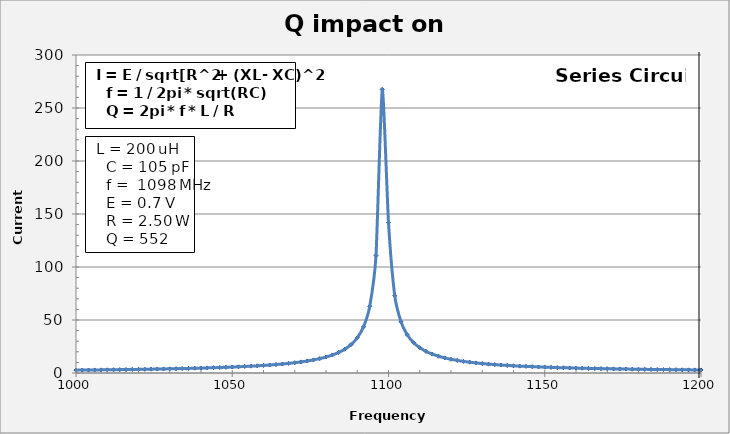
| Category | 552 |
|---|---|
| 900.0 | 1.265 |
| 902.0 | 1.28 |
| 904.0 | 1.294 |
| 906.0 | 1.309 |
| 908.0 | 1.325 |
| 910.0 | 1.34 |
| 912.0 | 1.356 |
| 914.0 | 1.373 |
| 916.0 | 1.39 |
| 918.0 | 1.407 |
| 920.0 | 1.424 |
| 922.0 | 1.442 |
| 924.0 | 1.46 |
| 926.0 | 1.479 |
| 928.0 | 1.498 |
| 930.0 | 1.518 |
| 932.0 | 1.538 |
| 934.0 | 1.558 |
| 936.0 | 1.579 |
| 938.0 | 1.601 |
| 940.0 | 1.623 |
| 942.0 | 1.645 |
| 944.0 | 1.669 |
| 946.0 | 1.692 |
| 948.0 | 1.717 |
| 950.0 | 1.742 |
| 952.0 | 1.768 |
| 954.0 | 1.794 |
| 956.0 | 1.822 |
| 958.0 | 1.85 |
| 960.0 | 1.879 |
| 962.0 | 1.908 |
| 964.0 | 1.939 |
| 966.0 | 1.97 |
| 968.0 | 2.003 |
| 970.0 | 2.036 |
| 972.0 | 2.071 |
| 974.0 | 2.106 |
| 976.0 | 2.143 |
| 978.0 | 2.181 |
| 980.0 | 2.22 |
| 982.0 | 2.261 |
| 984.0 | 2.303 |
| 986.0 | 2.346 |
| 988.0 | 2.391 |
| 990.0 | 2.438 |
| 992.0 | 2.487 |
| 994.0 | 2.537 |
| 996.0 | 2.589 |
| 998.0 | 2.644 |
| 1000.0 | 2.7 |
| 1002.0 | 2.759 |
| 1004.0 | 2.821 |
| 1006.0 | 2.885 |
| 1008.0 | 2.952 |
| 1010.0 | 3.022 |
| 1012.0 | 3.095 |
| 1014.0 | 3.172 |
| 1016.0 | 3.252 |
| 1018.0 | 3.337 |
| 1020.0 | 3.425 |
| 1022.0 | 3.519 |
| 1024.0 | 3.617 |
| 1026.0 | 3.721 |
| 1028.0 | 3.83 |
| 1030.0 | 3.946 |
| 1032.0 | 4.07 |
| 1034.0 | 4.2 |
| 1036.0 | 4.339 |
| 1038.0 | 4.488 |
| 1040.0 | 4.646 |
| 1042.0 | 4.816 |
| 1044.0 | 4.998 |
| 1046.0 | 5.194 |
| 1048.0 | 5.406 |
| 1050.0 | 5.635 |
| 1052.0 | 5.884 |
| 1054.0 | 6.156 |
| 1056.0 | 6.453 |
| 1058.0 | 6.779 |
| 1060.0 | 7.14 |
| 1062.0 | 7.54 |
| 1064.0 | 7.987 |
| 1066.0 | 8.489 |
| 1068.0 | 9.057 |
| 1070.0 | 9.706 |
| 1072.0 | 10.452 |
| 1074.0 | 11.322 |
| 1076.0 | 12.347 |
| 1078.0 | 13.573 |
| 1080.0 | 15.066 |
| 1082.0 | 16.923 |
| 1084.0 | 19.296 |
| 1086.0 | 22.434 |
| 1088.0 | 26.776 |
| 1090.0 | 33.172 |
| 1092.0 | 43.508 |
| 1094.0 | 62.909 |
| 1096.0 | 110.814 |
| 1098.0 | 267.633 |
| 1100.0 | 141.854 |
| 1102.0 | 72.918 |
| 1104.0 | 48.306 |
| 1106.0 | 36.025 |
| 1108.0 | 28.706 |
| 1110.0 | 23.857 |
| 1112.0 | 20.411 |
| 1114.0 | 17.837 |
| 1116.0 | 15.842 |
| 1118.0 | 14.25 |
| 1120.0 | 12.951 |
| 1122.0 | 11.87 |
| 1124.0 | 10.957 |
| 1126.0 | 10.176 |
| 1128.0 | 9.5 |
| 1130.0 | 8.909 |
| 1132.0 | 8.388 |
| 1134.0 | 7.925 |
| 1136.0 | 7.511 |
| 1138.0 | 7.139 |
| 1140.0 | 6.803 |
| 1142.0 | 6.497 |
| 1144.0 | 6.218 |
| 1146.0 | 5.963 |
| 1148.0 | 5.728 |
| 1150.0 | 5.511 |
| 1152.0 | 5.31 |
| 1154.0 | 5.124 |
| 1156.0 | 4.95 |
| 1158.0 | 4.789 |
| 1160.0 | 4.637 |
| 1162.0 | 4.496 |
| 1164.0 | 4.362 |
| 1166.0 | 4.237 |
| 1168.0 | 4.119 |
| 1170.0 | 4.007 |
| 1172.0 | 3.902 |
| 1174.0 | 3.802 |
| 1176.0 | 3.707 |
| 1178.0 | 3.617 |
| 1180.0 | 3.531 |
| 1182.0 | 3.45 |
| 1184.0 | 3.372 |
| 1186.0 | 3.298 |
| 1188.0 | 3.227 |
| 1190.0 | 3.159 |
| 1192.0 | 3.094 |
| 1194.0 | 3.032 |
| 1196.0 | 2.972 |
| 1198.0 | 2.915 |
| 1200.0 | 2.86 |
| 1202.0 | 2.807 |
| 1204.0 | 2.756 |
| 1206.0 | 2.707 |
| 1208.0 | 2.66 |
| 1210.0 | 2.614 |
| 1212.0 | 2.57 |
| 1214.0 | 2.528 |
| 1216.0 | 2.487 |
| 1218.0 | 2.447 |
| 1220.0 | 2.409 |
| 1222.0 | 2.372 |
| 1224.0 | 2.336 |
| 1226.0 | 2.301 |
| 1228.0 | 2.267 |
| 1230.0 | 2.235 |
| 1232.0 | 2.203 |
| 1234.0 | 2.172 |
| 1236.0 | 2.142 |
| 1238.0 | 2.113 |
| 1240.0 | 2.085 |
| 1242.0 | 2.057 |
| 1244.0 | 2.031 |
| 1246.0 | 2.005 |
| 1248.0 | 1.979 |
| 1250.0 | 1.955 |
| 1252.0 | 1.931 |
| 1254.0 | 1.907 |
| 1256.0 | 1.885 |
| 1258.0 | 1.862 |
| 1260.0 | 1.841 |
| 1262.0 | 1.819 |
| 1264.0 | 1.799 |
| 1266.0 | 1.779 |
| 1268.0 | 1.759 |
| 1270.0 | 1.74 |
| 1272.0 | 1.721 |
| 1274.0 | 1.703 |
| 1276.0 | 1.685 |
| 1278.0 | 1.667 |
| 1280.0 | 1.65 |
| 1282.0 | 1.633 |
| 1284.0 | 1.617 |
| 1286.0 | 1.601 |
| 1288.0 | 1.585 |
| 1290.0 | 1.57 |
| 1292.0 | 1.554 |
| 1294.0 | 1.54 |
| 1296.0 | 1.525 |
| 1298.0 | 1.511 |
| 1300.0 | 1.497 |
| 1302.0 | 1.483 |
| 1304.0 | 1.47 |
| 1306.0 | 1.457 |
| 1308.0 | 1.444 |
| 1310.0 | 1.431 |
| 1312.0 | 1.419 |
| 1314.0 | 1.407 |
| 1316.0 | 1.395 |
| 1318.0 | 1.383 |
| 1320.0 | 1.372 |
| 1322.0 | 1.36 |
| 1324.0 | 1.349 |
| 1326.0 | 1.338 |
| 1328.0 | 1.327 |
| 1330.0 | 1.317 |
| 1332.0 | 1.306 |
| 1334.0 | 1.296 |
| 1336.0 | 1.286 |
| 1338.0 | 1.276 |
| 1340.0 | 1.267 |
| 1342.0 | 1.257 |
| 1344.0 | 1.248 |
| 1346.0 | 1.238 |
| 1348.0 | 1.229 |
| 1350.0 | 1.22 |
| 1352.0 | 1.212 |
| 1354.0 | 1.203 |
| 1356.0 | 1.194 |
| 1358.0 | 1.186 |
| 1360.0 | 1.178 |
| 1362.0 | 1.169 |
| 1364.0 | 1.161 |
| 1366.0 | 1.153 |
| 1368.0 | 1.146 |
| 1370.0 | 1.138 |
| 1372.0 | 1.13 |
| 1374.0 | 1.123 |
| 1376.0 | 1.116 |
| 1378.0 | 1.108 |
| 1380.0 | 1.101 |
| 1382.0 | 1.094 |
| 1384.0 | 1.087 |
| 1386.0 | 1.08 |
| 1388.0 | 1.073 |
| 1390.0 | 1.067 |
| 1392.0 | 1.06 |
| 1394.0 | 1.054 |
| 1396.0 | 1.047 |
| 1398.0 | 1.041 |
| 1400.0 | 1.035 |
| 1402.0 | 1.029 |
| 1404.0 | 1.022 |
| 1406.0 | 1.016 |
| 1408.0 | 1.01 |
| 1410.0 | 1.005 |
| 1412.0 | 0.999 |
| 1414.0 | 0.993 |
| 1416.0 | 0.987 |
| 1418.0 | 0.982 |
| 1420.0 | 0.976 |
| 1422.0 | 0.971 |
| 1424.0 | 0.966 |
| 1426.0 | 0.96 |
| 1428.0 | 0.955 |
| 1430.0 | 0.95 |
| 1432.0 | 0.945 |
| 1434.0 | 0.94 |
| 1436.0 | 0.935 |
| 1438.0 | 0.93 |
| 1440.0 | 0.925 |
| 1442.0 | 0.92 |
| 1444.0 | 0.915 |
| 1446.0 | 0.911 |
| 1448.0 | 0.906 |
| 1450.0 | 0.901 |
| 1452.0 | 0.897 |
| 1454.0 | 0.892 |
| 1456.0 | 0.888 |
| 1458.0 | 0.883 |
| 1460.0 | 0.879 |
| 1462.0 | 0.875 |
| 1464.0 | 0.87 |
| 1466.0 | 0.866 |
| 1468.0 | 0.862 |
| 1470.0 | 0.858 |
| 1472.0 | 0.854 |
| 1474.0 | 0.85 |
| 1476.0 | 0.846 |
| 1478.0 | 0.842 |
| 1480.0 | 0.838 |
| 1482.0 | 0.834 |
| 1484.0 | 0.83 |
| 1486.0 | 0.826 |
| 1488.0 | 0.822 |